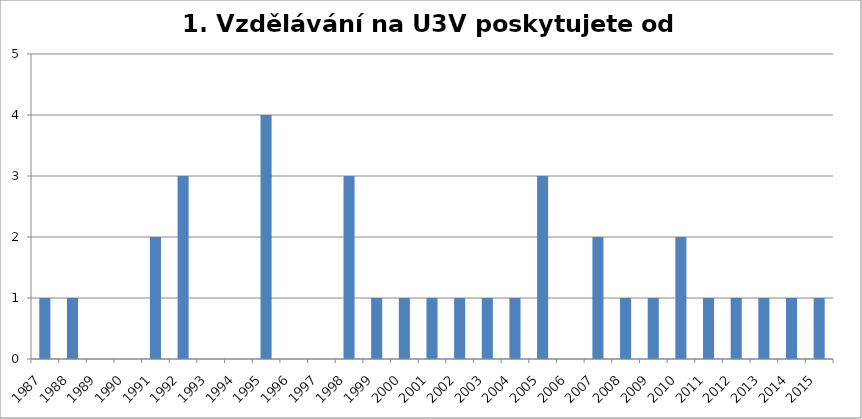
| Category | Series 0 |
|---|---|
| 1987.0 | 1 |
| 1988.0 | 1 |
| 1989.0 | 0 |
| 1990.0 | 0 |
| 1991.0 | 2 |
| 1992.0 | 3 |
| 1993.0 | 0 |
| 1994.0 | 0 |
| 1995.0 | 4 |
| 1996.0 | 0 |
| 1997.0 | 0 |
| 1998.0 | 3 |
| 1999.0 | 1 |
| 2000.0 | 1 |
| 2001.0 | 1 |
| 2002.0 | 1 |
| 2003.0 | 1 |
| 2004.0 | 1 |
| 2005.0 | 3 |
| 2006.0 | 0 |
| 2007.0 | 2 |
| 2008.0 | 1 |
| 2009.0 | 1 |
| 2010.0 | 2 |
| 2011.0 | 1 |
| 2012.0 | 1 |
| 2013.0 | 1 |
| 2014.0 | 1 |
| 2015.0 | 1 |